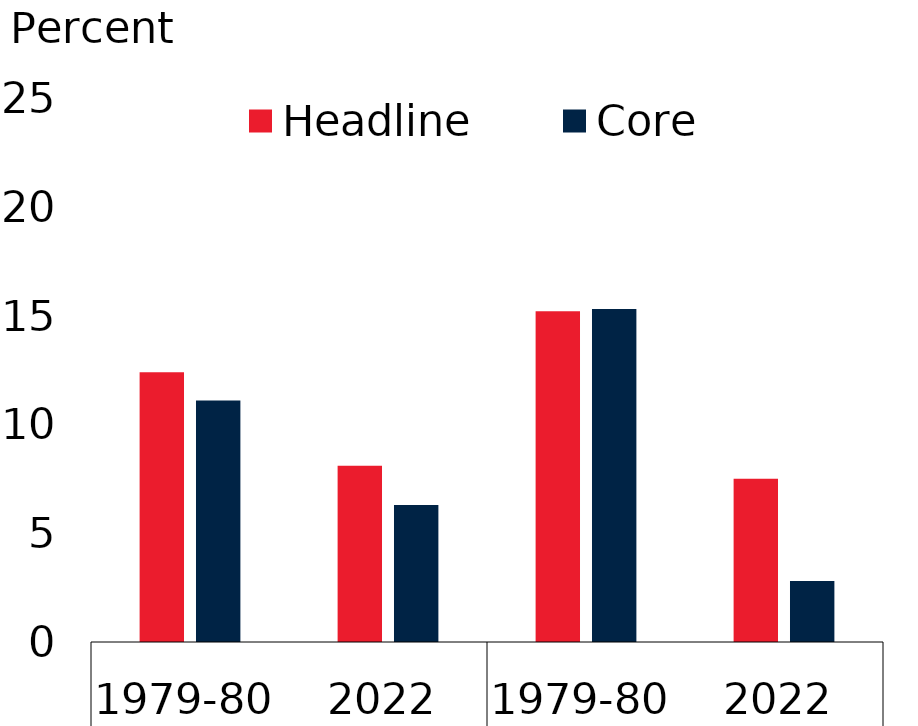
| Category | Headline  | Core |
|---|---|---|
| 0 | 12.4 | 11.1 |
| 1 | 8.1 | 6.3 |
| 2 | 15.2 | 15.3 |
| 3 | 7.5 | 2.8 |